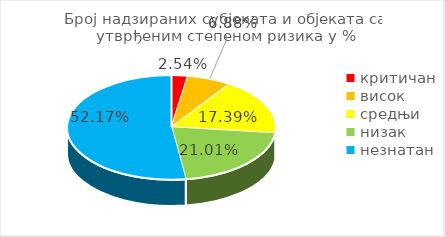
| Category | Series 0 |
|---|---|
| критичан | 0.025 |
| висок | 0.069 |
| средњи | 0.174 |
| низак | 0.21 |
| незнатан | 0.522 |